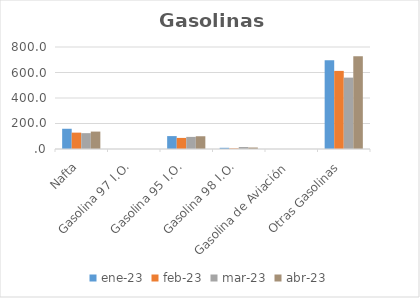
| Category | ene-23 | feb-23 | mar-23 | abr-23 |
|---|---|---|---|---|
| Nafta | 158.685 | 128.378 | 124.334 | 136.59 |
| Gasolina 97 I.O. | 0 | 0 | 0 | 0 |
| Gasolina 95 I.O. | 101.207 | 86.973 | 94.97 | 99.983 |
| Gasolina 98 I.O. | 9.389 | 4.343 | 15.383 | 11.562 |
| Gasolina de Aviación | 0 | 0 | 0 | 0 |
| Otras Gasolinas | 697.044 | 612.63 | 559.85 | 727.696 |